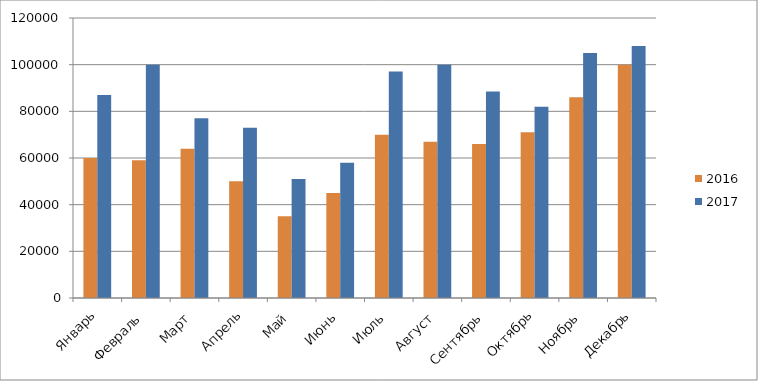
| Category | 2016 | 2017 |
|---|---|---|
| Январь | 60000 | 87000 |
| Февраль | 59000 | 100000 |
| Март | 64000 | 77000 |
| Апрель | 50000 | 73000 |
| Май | 35000 | 51000 |
| Июнь | 45000 | 58000 |
| Июль | 70000 | 97100 |
| Август | 67000 | 100000 |
| Сентябрь | 66000 | 88500 |
| Октябрь | 71000 | 82000 |
| Ноябрь | 86000 | 105000 |
| Декабрь | 100000 | 108000 |